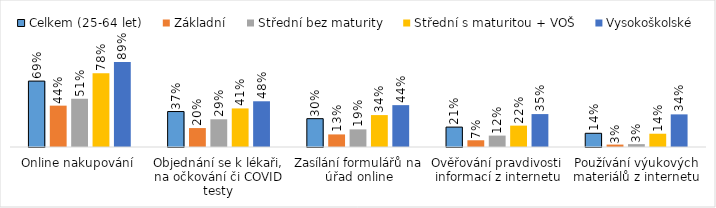
| Category | Celkem (25-64 let) | Základní | Střední bez maturity | Střední s maturitou + VOŠ | Vysokoškolské |
|---|---|---|---|---|---|
| Online nakupování | 0.694 | 0.435 | 0.508 | 0.776 | 0.894 |
| Objednání se k lékaři, na očkování či COVID testy | 0.373 | 0.199 | 0.292 | 0.406 | 0.481 |
| Zasílání formulářů na úřad online | 0.298 | 0.132 | 0.185 | 0.336 | 0.441 |
| Ověřování pravdivosti informací z internetu | 0.209 | 0.071 | 0.12 | 0.225 | 0.346 |
| Používání výukových materiálů z internetu | 0.144 | 0.025 | 0.03 | 0.14 | 0.343 |